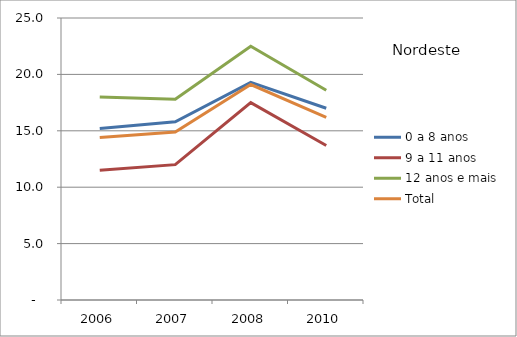
| Category | 0 a 8 anos | 9 a 11 anos | 12 anos e mais | Total |
|---|---|---|---|---|
| 2006.0 | 15.2 | 11.5 | 18 | 14.4 |
| 2007.0 | 15.8 | 12 | 17.8 | 14.9 |
| 2008.0 | 19.3 | 17.5 | 22.5 | 19.1 |
| 2010.0 | 17 | 13.7 | 18.6 | 16.2 |